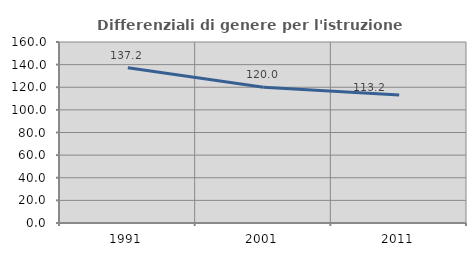
| Category | Differenziali di genere per l'istruzione superiore |
|---|---|
| 1991.0 | 137.178 |
| 2001.0 | 119.967 |
| 2011.0 | 113.175 |